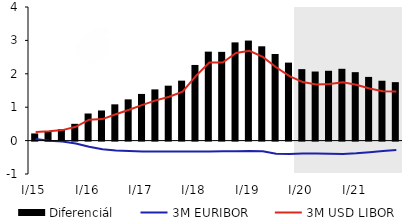
| Category | Diferenciál |
|---|---|
| I/15 | 0.215 |
| II | 0.286 |
| III | 0.342 |
| IV | 0.502 |
| I/16 | 0.811 |
| II | 0.902 |
| III | 1.086 |
| IV | 1.235 |
| I/17 | 1.397 |
| II | 1.533 |
| III | 1.645 |
| IV | 1.795 |
| I/18 | 2.265 |
| II | 2.663 |
| III | 2.657 |
| IV | 2.941 |
| I/19 | 2.995 |
| II | 2.824 |
| III | 2.593 |
| IV | 2.335 |
| I/20 | 2.14 |
| II | 2.068 |
| III | 2.09 |
| IV | 2.15 |
| I/21 | 2.049 |
| II | 1.907 |
| III | 1.792 |
| IV | 1.75 |